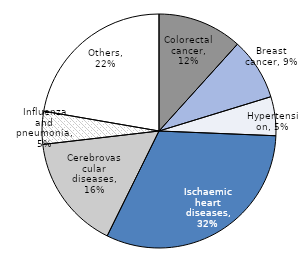
| Category | Amenable mortality |
|---|---|
| Colorectal cancer | 0.117 |
| Breast cancer | 0.086 |
| Hypertension | 0.054 |
| Ischaemic heart diseases | 0.317 |
| Cerebrovascular diseases | 0.159 |
| Influenza and pneumonia | 0.046 |
| Others | 0.223 |